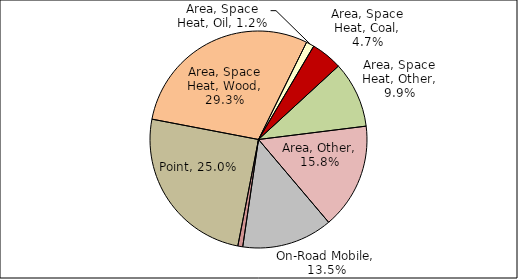
| Category | Series 0 |
|---|---|
| Point | 0.25 |
| Area, Space Heat, Wood | 0.293 |
| Area, Space Heat, Oil | 0.012 |
| Area, Space Heat, Coal | 0.047 |
| Area, Space Heat, Other | 0.099 |
| Area, Other | 0.158 |
| On-Road Mobile | 0.135 |
| Non-Road Mobile | 0.007 |